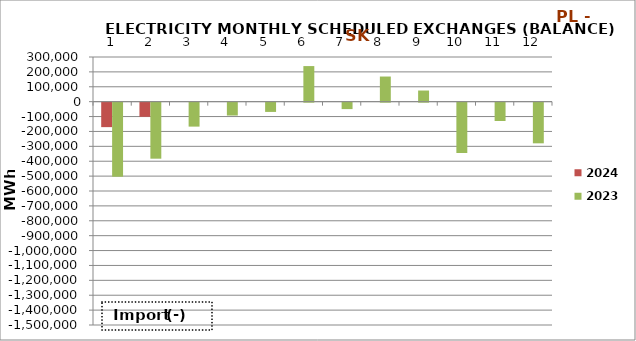
| Category | 2024 | 2023 |
|---|---|---|
| 0 | -164316.8 | -497249.3 |
| 1 | -94983.2 | -376275.2 |
| 2 | 0 | -160843.3 |
| 3 | 0 | -86467.3 |
| 4 | 0 | -62161.3 |
| 5 | 0 | 239002.6 |
| 6 | 0 | -43237.1 |
| 7 | 0 | 168802 |
| 8 | 0 | 74825.5 |
| 9 | 0 | -338067 |
| 10 | 0 | -123245.4 |
| 11 | 0 | -273058.9 |